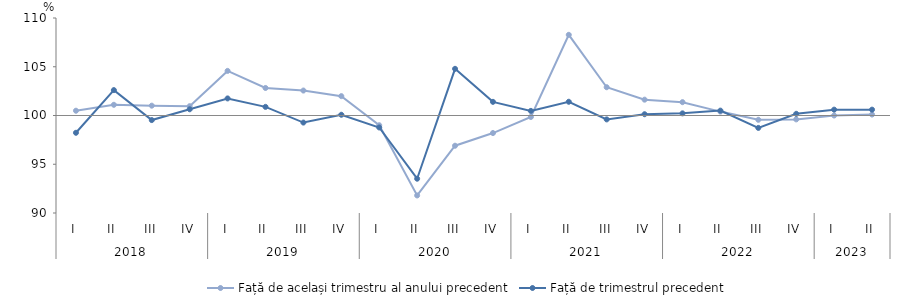
| Category | Față de același trimestru al anului precedent | Față de trimestrul precedent |
|---|---|---|
| 0 | 100.491 | 98.228 |
| 1 | 101.097 | 102.604 |
| 2 | 101.008 | 99.53 |
| 3 | 100.954 | 100.639 |
| 4 | 104.574 | 101.751 |
| 5 | 102.823 | 100.886 |
| 6 | 102.56 | 99.275 |
| 7 | 101.986 | 100.076 |
| 8 | 99 | 98.772 |
| 9 | 91.8 | 93.516 |
| 10 | 96.9 | 104.788 |
| 11 | 98.2 | 101.4 |
| 12 | 99.847 | 100.472 |
| 13 | 108.274 | 101.409 |
| 14 | 102.9 | 99.6 |
| 15 | 101.623 | 100.13 |
| 16 | 101.369 | 100.22 |
| 17 | 100.4 | 100.5 |
| 18 | 99.559 | 98.729 |
| 19 | 99.601 | 100.173 |
| 20 | 100 | 100.6 |
| 21 | 100.1 | 100.6 |